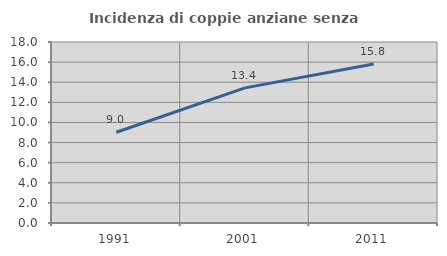
| Category | Incidenza di coppie anziane senza figli  |
|---|---|
| 1991.0 | 9.022 |
| 2001.0 | 13.439 |
| 2011.0 | 15.81 |